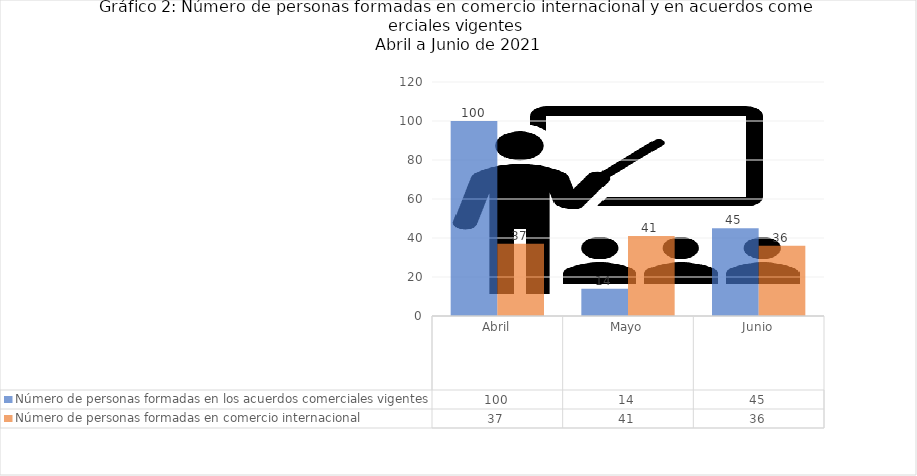
| Category | Número de personas formadas en los acuerdos comerciales vigentes | Número de personas formadas en comercio internacional  |
|---|---|---|
| Abril | 100 | 37 |
| Mayo | 14 | 41 |
| Junio | 45 | 36 |